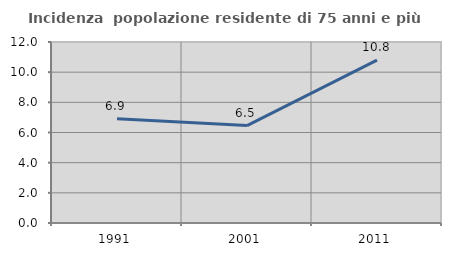
| Category | Incidenza  popolazione residente di 75 anni e più |
|---|---|
| 1991.0 | 6.906 |
| 2001.0 | 6.456 |
| 2011.0 | 10.803 |